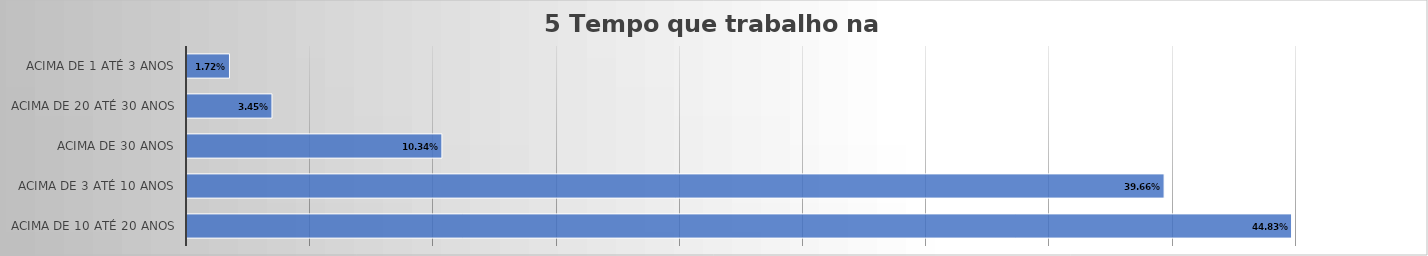
| Category | 5 Tempo que trabalho na organização |
|---|---|
| Acima de 10 até 20 anos | 0.448 |
| Acima de 3 até 10 anos | 0.397 |
| Acima de 30 anos | 0.103 |
| Acima de 20 até 30 anos | 0.034 |
| Acima de 1 até 3 anos | 0.017 |